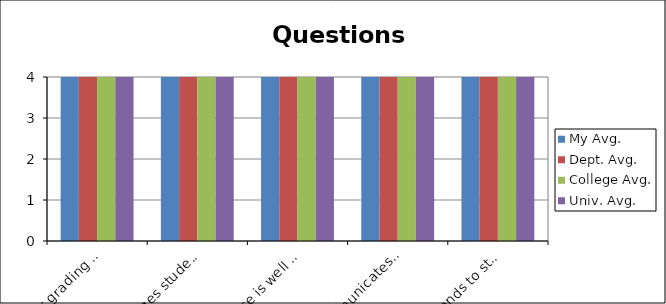
| Category | My Avg. | Dept. Avg. | College Avg. | Univ. Avg. |
|---|---|---|---|---|
| 0 | 4 | 4 | 4 | 4 |
| 1 | 4 | 4 | 4 | 4 |
| 2 | 4 | 4 | 4 | 4 |
| 3 | 4 | 4 | 4 | 4 |
| 4 | 4 | 4 | 4 | 4 |